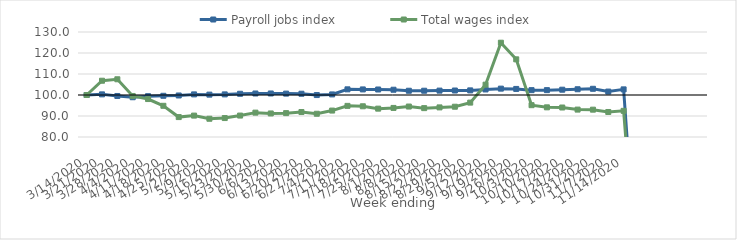
| Category | Payroll jobs index | Total wages index |
|---|---|---|
| 14/03/2020 | 100 | 100 |
| 21/03/2020 | 100.302 | 106.797 |
| 28/03/2020 | 99.532 | 107.486 |
| 04/04/2020 | 98.936 | 99.533 |
| 11/04/2020 | 99.438 | 98.067 |
| 18/04/2020 | 99.624 | 94.852 |
| 25/04/2020 | 99.771 | 89.486 |
| 02/05/2020 | 100.295 | 90.192 |
| 09/05/2020 | 100.174 | 88.687 |
| 16/05/2020 | 100.295 | 89.021 |
| 23/05/2020 | 100.581 | 90.208 |
| 30/05/2020 | 100.715 | 91.601 |
| 06/06/2020 | 100.727 | 91.212 |
| 13/06/2020 | 100.659 | 91.366 |
| 20/06/2020 | 100.597 | 91.885 |
| 27/06/2020 | 99.974 | 91.068 |
| 04/07/2020 | 100.279 | 92.585 |
| 11/07/2020 | 102.696 | 94.826 |
| 18/07/2020 | 102.658 | 94.634 |
| 25/07/2020 | 102.624 | 93.502 |
| 01/08/2020 | 102.508 | 93.842 |
| 08/08/2020 | 102.03 | 94.502 |
| 15/08/2020 | 102.031 | 93.744 |
| 22/08/2020 | 102.087 | 94.092 |
| 29/08/2020 | 102.142 | 94.416 |
| 05/09/2020 | 102.202 | 96.375 |
| 12/09/2020 | 102.647 | 104.92 |
| 19/09/2020 | 103.032 | 124.901 |
| 26/09/2020 | 102.892 | 116.984 |
| 03/10/2020 | 102.307 | 95.153 |
| 10/10/2020 | 102.319 | 94.125 |
| 17/10/2020 | 102.529 | 94.044 |
| 24/10/2020 | 102.741 | 93.049 |
| 31/10/2020 | 102.954 | 93.017 |
| 07/11/2020 | 101.635 | 91.909 |
| 14/11/2020 | 102.677 | 92.461 |